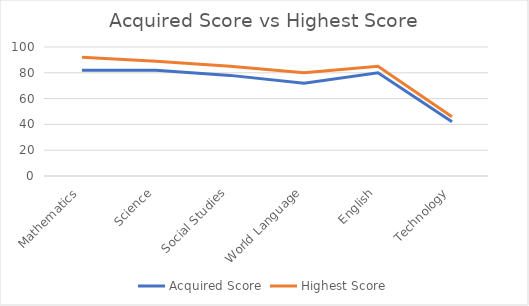
| Category | Acquired Score | Highest Score |
|---|---|---|
| Mathematics | 82 | 92 |
| Science | 82 | 89 |
| Social Studies | 78 | 85 |
| World Language | 72 | 80 |
| English | 80 | 85 |
| Technology | 42 | 46 |